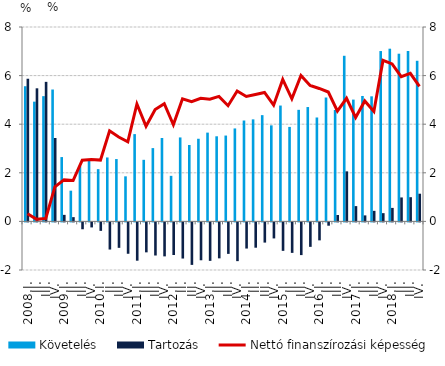
| Category | Követelés | Tartozás |
|---|---|---|
| 2008.I. | 5.563 | 5.871 |
| II. | 4.928 | 5.477 |
| III. | 5.154 | 5.743 |
| IV. | 5.427 | 3.431 |
| 2009.I. | 2.647 | 0.269 |
| II. | 1.264 | 0.175 |
| III. | 2.29 | -0.282 |
| IV. | 2.503 | -0.207 |
| 2010.I. | 2.15 | -0.348 |
| II. | 2.631 | -1.117 |
| III. | 2.565 | -1.047 |
| IV. | 1.855 | -1.291 |
| 2011.I. | 3.592 | -1.576 |
| II. | 2.534 | -1.232 |
| III. | 3.017 | -1.362 |
| IV. | 3.433 | -1.398 |
| 2012.I. | 1.875 | -1.342 |
| II. | 3.455 | -1.487 |
| III. | 3.144 | -1.749 |
| IV. | 3.401 | -1.558 |
| 2013.I. | 3.654 | -1.582 |
| II. | 3.503 | -1.479 |
| III. | 3.533 | -1.295 |
| IV. | 3.826 | -1.594 |
| 2014.I. | 4.152 | -1.076 |
| II. | 4.199 | -1.042 |
| III. | 4.373 | -0.831 |
| IV. | 3.953 | -0.659 |
| 2015.I. | 4.768 | -1.171 |
| II. | 3.888 | -1.254 |
| III. | 4.592 | -1.346 |
| IV. | 4.706 | -1.006 |
| 2016.I. | 4.276 | -0.74 |
| II. | 5.098 | -0.136 |
| III. | 4.584 | 0.262 |
| IV. | 6.816 | 2.06 |
| 2017.I. | 5.012 | 0.63 |
| II. | 5.162 | 0.247 |
| III. | 5.147 | 0.435 |
| IV. | 7.011 | 0.339 |
| 2018.I. | 7.107 | 0.555 |
| II. | 6.901 | 0.986 |
| III. | 7.013 | 0.996 |
| IV. | 6.61 | 1.14 |